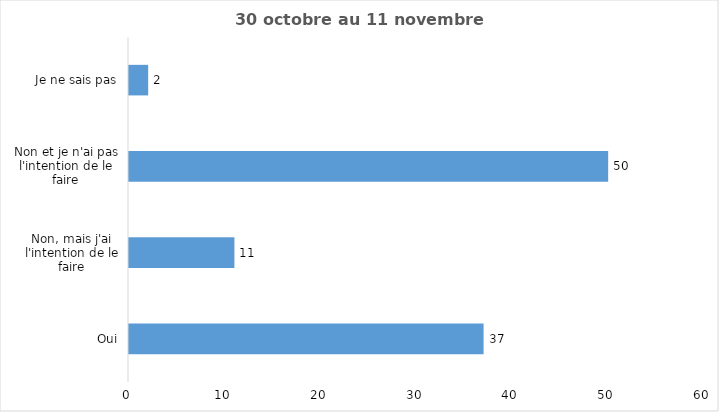
| Category | Series 0 |
|---|---|
| Oui | 37 |
| Non, mais j'ai l'intention de le faire | 11 |
| Non et je n'ai pas l'intention de le faire | 50 |
| Je ne sais pas | 2 |